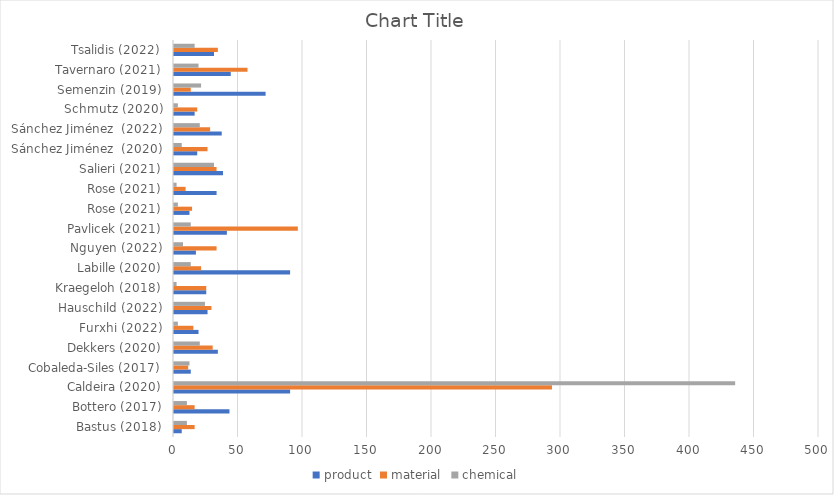
| Category | product | material | chemical |
|---|---|---|---|
| Bastus (2018) | 6 | 16 | 10 |
| Bottero (2017) | 43 | 16 | 10 |
| Caldeira (2020) | 90 | 293 | 435 |
| Cobaleda-Siles (2017) | 13 | 11 | 12 |
| Dekkers (2020) | 34 | 30 | 20 |
| Furxhi (2022) | 19 | 15 | 3 |
| Hauschild (2022) | 26 | 29 | 24 |
| Kraegeloh (2018) | 25 | 25 | 2 |
| Labille (2020) | 90 | 21 | 13 |
| Nguyen (2022) | 17 | 33 | 7 |
| Pavlicek (2021) | 41 | 96 | 13 |
| Rose (2021) | 12 | 14 | 3 |
| Rose (2021) | 33 | 9 | 2 |
| Salieri (2021) | 38 | 33 | 31 |
| Sánchez Jiménez  (2020) | 18 | 26 | 6 |
| Sánchez Jiménez  (2022) | 37 | 28 | 20 |
| Schmutz (2020) | 16 | 18 | 3 |
| Semenzin (2019) | 71 | 13 | 21 |
| Tavernaro (2021) | 44 | 57 | 19 |
| Tsalidis (2022) | 31 | 34 | 16 |